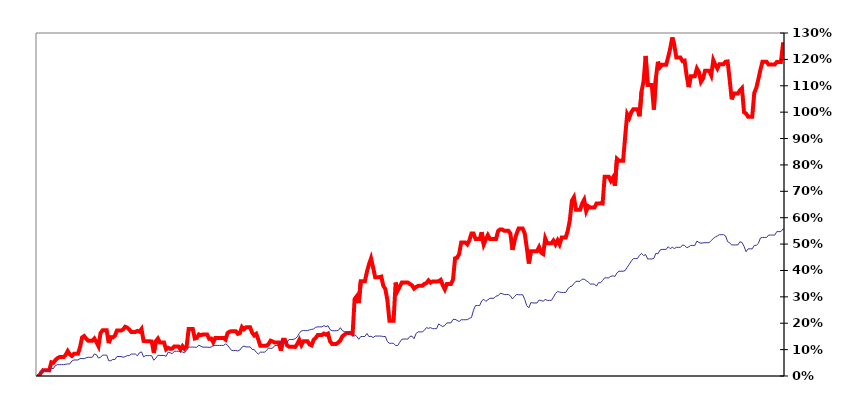
| Category | Series 0 |
|---|---|
| 31/12/2012 | 0 |
| 01/01/2013 | 0 |
| 02/01/2013 | 0.013 |
| 03/01/2013 | 0.022 |
| 04/01/2013 | 0.022 |
| 05/01/2013 | 0.022 |
| 06/01/2013 | 0.022 |
| 07/01/2013 | 0.052 |
| 08/01/2013 | 0.05 |
| 09/01/2013 | 0.06 |
| 10/01/2013 | 0.068 |
| 11/01/2013 | 0.072 |
| 12/01/2013 | 0.072 |
| 13/01/2013 | 0.072 |
| 14/01/2013 | 0.08 |
| 15/01/2013 | 0.095 |
| 16/01/2013 | 0.082 |
| 17/01/2013 | 0.076 |
| 18/01/2013 | 0.084 |
| 19/01/2013 | 0.084 |
| 20/01/2013 | 0.084 |
| 21/01/2013 | 0.109 |
| 22/01/2013 | 0.146 |
| 23/01/2013 | 0.151 |
| 24/01/2013 | 0.141 |
| 25/01/2013 | 0.134 |
| 26/01/2013 | 0.134 |
| 27/01/2013 | 0.134 |
| 28/01/2013 | 0.142 |
| 29/01/2013 | 0.129 |
| 30/01/2013 | 0.113 |
| 31/01/2013 | 0.163 |
| 01/02/2013 | 0.173 |
| 02/02/2013 | 0.173 |
| 03/02/2013 | 0.173 |
| 04/02/2013 | 0.125 |
| 05/02/2013 | 0.147 |
| 06/02/2013 | 0.146 |
| 07/02/2013 | 0.152 |
| 08/02/2013 | 0.172 |
| 09/02/2013 | 0.172 |
| 10/02/2013 | 0.172 |
| 11/02/2013 | 0.176 |
| 12/02/2013 | 0.187 |
| 13/02/2013 | 0.183 |
| 14/02/2013 | 0.176 |
| 15/02/2013 | 0.167 |
| 16/02/2013 | 0.167 |
| 17/02/2013 | 0.167 |
| 18/02/2013 | 0.171 |
| 19/02/2013 | 0.168 |
| 20/02/2013 | 0.178 |
| 21/02/2013 | 0.133 |
| 22/02/2013 | 0.132 |
| 23/02/2013 | 0.132 |
| 24/02/2013 | 0.132 |
| 25/02/2013 | 0.131 |
| 26/02/2013 | 0.087 |
| 27/02/2013 | 0.132 |
| 28/02/2013 | 0.142 |
| 01/03/2013 | 0.127 |
| 02/03/2013 | 0.127 |
| 03/03/2013 | 0.127 |
| 04/03/2013 | 0.101 |
| 05/03/2013 | 0.107 |
| 06/03/2013 | 0.103 |
| 07/03/2013 | 0.104 |
| 08/03/2013 | 0.112 |
| 09/03/2013 | 0.112 |
| 10/03/2013 | 0.112 |
| 11/03/2013 | 0.101 |
| 12/03/2013 | 0.113 |
| 13/03/2013 | 0.103 |
| 14/03/2013 | 0.111 |
| 15/03/2013 | 0.178 |
| 16/03/2013 | 0.178 |
| 17/03/2013 | 0.178 |
| 18/03/2013 | 0.142 |
| 19/03/2013 | 0.144 |
| 20/03/2013 | 0.158 |
| 21/03/2013 | 0.155 |
| 22/03/2013 | 0.158 |
| 23/03/2013 | 0.158 |
| 24/03/2013 | 0.158 |
| 25/03/2013 | 0.141 |
| 26/03/2013 | 0.142 |
| 27/03/2013 | 0.128 |
| 28/03/2013 | 0.144 |
| 29/03/2013 | 0.144 |
| 30/03/2013 | 0.144 |
| 31/03/2013 | 0.144 |
| 01/04/2013 | 0.144 |
| 02/04/2013 | 0.138 |
| 03/04/2013 | 0.163 |
| 04/04/2013 | 0.168 |
| 05/04/2013 | 0.17 |
| 06/04/2013 | 0.17 |
| 07/04/2013 | 0.17 |
| 08/04/2013 | 0.16 |
| 09/04/2013 | 0.163 |
| 10/04/2013 | 0.186 |
| 11/04/2013 | 0.177 |
| 12/04/2013 | 0.184 |
| 13/04/2013 | 0.184 |
| 14/04/2013 | 0.184 |
| 15/04/2013 | 0.164 |
| 16/04/2013 | 0.153 |
| 17/04/2013 | 0.16 |
| 18/04/2013 | 0.138 |
| 19/04/2013 | 0.114 |
| 20/04/2013 | 0.114 |
| 21/04/2013 | 0.114 |
| 22/04/2013 | 0.114 |
| 23/04/2013 | 0.121 |
| 24/04/2013 | 0.134 |
| 25/04/2013 | 0.131 |
| 26/04/2013 | 0.127 |
| 27/04/2013 | 0.127 |
| 28/04/2013 | 0.127 |
| 29/04/2013 | 0.096 |
| 30/04/2013 | 0.137 |
| 01/05/2013 | 0.137 |
| 02/05/2013 | 0.116 |
| 03/05/2013 | 0.111 |
| 04/05/2013 | 0.111 |
| 05/05/2013 | 0.111 |
| 06/05/2013 | 0.11 |
| 07/05/2013 | 0.121 |
| 08/05/2013 | 0.137 |
| 09/05/2013 | 0.117 |
| 10/05/2013 | 0.132 |
| 11/05/2013 | 0.132 |
| 12/05/2013 | 0.132 |
| 13/05/2013 | 0.119 |
| 14/05/2013 | 0.116 |
| 15/05/2013 | 0.137 |
| 16/05/2013 | 0.144 |
| 17/05/2013 | 0.156 |
| 18/05/2013 | 0.156 |
| 19/05/2013 | 0.156 |
| 20/05/2013 | 0.161 |
| 21/05/2013 | 0.157 |
| 22/05/2013 | 0.161 |
| 23/05/2013 | 0.132 |
| 24/05/2013 | 0.121 |
| 25/05/2013 | 0.121 |
| 26/05/2013 | 0.121 |
| 27/05/2013 | 0.127 |
| 28/05/2013 | 0.135 |
| 29/05/2013 | 0.15 |
| 30/05/2013 | 0.157 |
| 31/05/2013 | 0.163 |
| 01/06/2013 | 0.163 |
| 02/06/2013 | 0.163 |
| 03/06/2013 | 0.16 |
| 04/06/2013 | 0.292 |
| 05/06/2013 | 0.302 |
| 06/06/2013 | 0.276 |
| 07/06/2013 | 0.359 |
| 08/06/2013 | 0.359 |
| 09/06/2013 | 0.359 |
| 10/06/2013 | 0.395 |
| 11/06/2013 | 0.423 |
| 12/06/2013 | 0.446 |
| 13/06/2013 | 0.412 |
| 14/06/2013 | 0.375 |
| 15/06/2013 | 0.375 |
| 16/06/2013 | 0.375 |
| 17/06/2013 | 0.377 |
| 18/06/2013 | 0.342 |
| 19/06/2013 | 0.329 |
| 20/06/2013 | 0.286 |
| 21/06/2013 | 0.209 |
| 22/06/2013 | 0.209 |
| 23/06/2013 | 0.209 |
| 24/06/2013 | 0.354 |
| 25/06/2013 | 0.323 |
| 26/06/2013 | 0.339 |
| 27/06/2013 | 0.354 |
| 28/06/2013 | 0.354 |
| 29/06/2013 | 0.354 |
| 30/06/2013 | 0.354 |
| 01/07/2013 | 0.349 |
| 02/07/2013 | 0.344 |
| 03/07/2013 | 0.331 |
| 04/07/2013 | 0.337 |
| 05/07/2013 | 0.342 |
| 06/07/2013 | 0.342 |
| 07/07/2013 | 0.342 |
| 08/07/2013 | 0.349 |
| 09/07/2013 | 0.352 |
| 10/07/2013 | 0.362 |
| 11/07/2013 | 0.354 |
| 12/07/2013 | 0.358 |
| 13/07/2013 | 0.358 |
| 14/07/2013 | 0.358 |
| 15/07/2013 | 0.359 |
| 16/07/2013 | 0.364 |
| 17/07/2013 | 0.344 |
| 18/07/2013 | 0.328 |
| 19/07/2013 | 0.349 |
| 20/07/2013 | 0.349 |
| 21/07/2013 | 0.349 |
| 22/07/2013 | 0.365 |
| 23/07/2013 | 0.446 |
| 24/07/2013 | 0.448 |
| 25/07/2013 | 0.463 |
| 26/07/2013 | 0.506 |
| 27/07/2013 | 0.506 |
| 28/07/2013 | 0.506 |
| 29/07/2013 | 0.499 |
| 30/07/2013 | 0.514 |
| 31/07/2013 | 0.54 |
| 01/08/2013 | 0.54 |
| 02/08/2013 | 0.519 |
| 03/08/2013 | 0.519 |
| 04/08/2013 | 0.519 |
| 05/08/2013 | 0.545 |
| 06/08/2013 | 0.499 |
| 07/08/2013 | 0.517 |
| 08/08/2013 | 0.534 |
| 09/08/2013 | 0.519 |
| 10/08/2013 | 0.519 |
| 11/08/2013 | 0.519 |
| 12/08/2013 | 0.519 |
| 13/08/2013 | 0.549 |
| 14/08/2013 | 0.556 |
| 15/08/2013 | 0.556 |
| 16/08/2013 | 0.55 |
| 17/08/2013 | 0.55 |
| 18/08/2013 | 0.55 |
| 19/08/2013 | 0.54 |
| 20/08/2013 | 0.478 |
| 21/08/2013 | 0.512 |
| 22/08/2013 | 0.539 |
| 23/08/2013 | 0.559 |
| 24/08/2013 | 0.559 |
| 25/08/2013 | 0.559 |
| 26/08/2013 | 0.54 |
| 27/08/2013 | 0.486 |
| 28/08/2013 | 0.426 |
| 29/08/2013 | 0.473 |
| 30/08/2013 | 0.473 |
| 31/08/2013 | 0.473 |
| 01/09/2013 | 0.473 |
| 02/09/2013 | 0.488 |
| 03/09/2013 | 0.468 |
| 04/09/2013 | 0.463 |
| 05/09/2013 | 0.521 |
| 06/09/2013 | 0.503 |
| 07/09/2013 | 0.503 |
| 08/09/2013 | 0.503 |
| 09/09/2013 | 0.513 |
| 10/09/2013 | 0.499 |
| 11/09/2013 | 0.514 |
| 12/09/2013 | 0.499 |
| 13/09/2013 | 0.525 |
| 14/09/2013 | 0.525 |
| 15/09/2013 | 0.525 |
| 16/09/2013 | 0.55 |
| 17/09/2013 | 0.591 |
| 18/09/2013 | 0.664 |
| 19/09/2013 | 0.678 |
| 20/09/2013 | 0.63 |
| 21/09/2013 | 0.63 |
| 22/09/2013 | 0.63 |
| 23/09/2013 | 0.654 |
| 24/09/2013 | 0.668 |
| 25/09/2013 | 0.625 |
| 26/09/2013 | 0.643 |
| 27/09/2013 | 0.638 |
| 28/09/2013 | 0.638 |
| 29/09/2013 | 0.638 |
| 30/09/2013 | 0.654 |
| 01/10/2013 | 0.654 |
| 02/10/2013 | 0.655 |
| 03/10/2013 | 0.654 |
| 04/10/2013 | 0.755 |
| 05/10/2013 | 0.755 |
| 06/10/2013 | 0.755 |
| 07/10/2013 | 0.74 |
| 08/10/2013 | 0.752 |
| 09/10/2013 | 0.721 |
| 10/10/2013 | 0.823 |
| 11/10/2013 | 0.816 |
| 12/10/2013 | 0.816 |
| 13/10/2013 | 0.816 |
| 14/10/2013 | 0.907 |
| 15/10/2013 | 0.993 |
| 16/10/2013 | 0.978 |
| 17/10/2013 | 1 |
| 18/10/2013 | 1.011 |
| 19/10/2013 | 1.011 |
| 20/10/2013 | 1.011 |
| 21/10/2013 | 0.984 |
| 22/10/2013 | 1.079 |
| 23/10/2013 | 1.118 |
| 24/10/2013 | 1.213 |
| 25/10/2013 | 1.103 |
| 26/10/2013 | 1.103 |
| 27/10/2013 | 1.103 |
| 28/10/2013 | 1.009 |
| 29/10/2013 | 1.129 |
| 30/10/2013 | 1.191 |
| 31/10/2013 | 1.171 |
| 01/11/2013 | 1.18 |
| 02/11/2013 | 1.18 |
| 03/11/2013 | 1.18 |
| 04/11/2013 | 1.209 |
| 05/11/2013 | 1.242 |
| 06/11/2013 | 1.283 |
| 07/11/2013 | 1.253 |
| 08/11/2013 | 1.207 |
| 09/11/2013 | 1.207 |
| 10/11/2013 | 1.207 |
| 11/11/2013 | 1.193 |
| 12/11/2013 | 1.195 |
| 13/11/2013 | 1.139 |
| 14/11/2013 | 1.095 |
| 15/11/2013 | 1.136 |
| 16/11/2013 | 1.136 |
| 17/11/2013 | 1.136 |
| 18/11/2013 | 1.165 |
| 19/11/2013 | 1.152 |
| 20/11/2013 | 1.115 |
| 21/11/2013 | 1.127 |
| 22/11/2013 | 1.157 |
| 23/11/2013 | 1.157 |
| 24/11/2013 | 1.157 |
| 25/11/2013 | 1.14 |
| 26/11/2013 | 1.197 |
| 27/11/2013 | 1.18 |
| 28/11/2013 | 1.165 |
| 29/11/2013 | 1.182 |
| 30/11/2013 | 1.182 |
| 01/12/2013 | 1.182 |
| 02/12/2013 | 1.191 |
| 03/12/2013 | 1.192 |
| 04/12/2013 | 1.123 |
| 05/12/2013 | 1.049 |
| 06/12/2013 | 1.07 |
| 07/12/2013 | 1.07 |
| 08/12/2013 | 1.07 |
| 09/12/2013 | 1.083 |
| 10/12/2013 | 1.091 |
| 11/12/2013 | 1 |
| 12/12/2013 | 0.995 |
| 13/12/2013 | 0.982 |
| 14/12/2013 | 0.982 |
| 15/12/2013 | 0.982 |
| 16/12/2013 | 1.072 |
| 17/12/2013 | 1.092 |
| 18/12/2013 | 1.125 |
| 19/12/2013 | 1.16 |
| 20/12/2013 | 1.191 |
| 21/12/2013 | 1.191 |
| 22/12/2013 | 1.191 |
| 23/12/2013 | 1.181 |
| 24/12/2013 | 1.181 |
| 25/12/2013 | 1.181 |
| 26/12/2013 | 1.181 |
| 27/12/2013 | 1.19 |
| 28/12/2013 | 1.19 |
| 29/12/2013 | 1.19 |
| 30/12/2013 | 1.257 |
| 31/12/2013 | 1.257 |